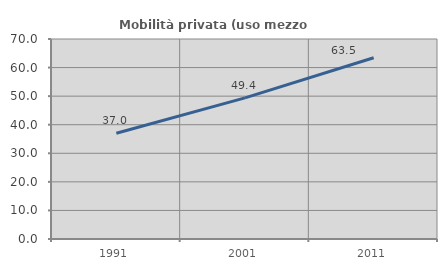
| Category | Mobilità privata (uso mezzo privato) |
|---|---|
| 1991.0 | 37.022 |
| 2001.0 | 49.398 |
| 2011.0 | 63.45 |